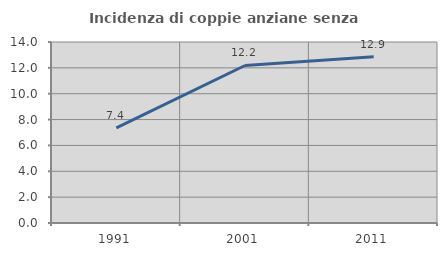
| Category | Incidenza di coppie anziane senza figli  |
|---|---|
| 1991.0 | 7.362 |
| 2001.0 | 12.183 |
| 2011.0 | 12.857 |